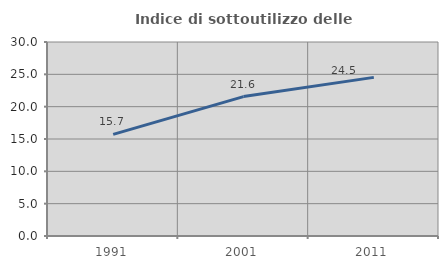
| Category | Indice di sottoutilizzo delle abitazioni  |
|---|---|
| 1991.0 | 15.71 |
| 2001.0 | 21.556 |
| 2011.0 | 24.529 |